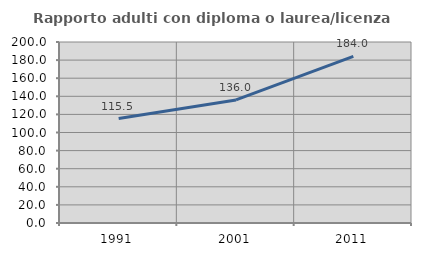
| Category | Rapporto adulti con diploma o laurea/licenza media  |
|---|---|
| 1991.0 | 115.466 |
| 2001.0 | 136.005 |
| 2011.0 | 184.049 |